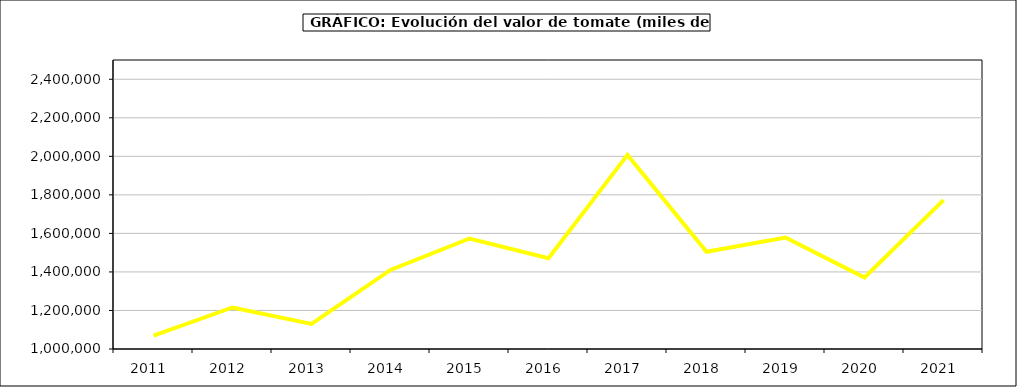
| Category | Valor |
|---|---|
| 2011.0 | 1069974.828 |
| 2012.0 | 1215542.465 |
| 2013.0 | 1130344.662 |
| 2014.0 | 1410496.854 |
| 2015.0 | 1573527 |
| 2016.0 | 1471672 |
| 2017.0 | 2007555.581 |
| 2018.0 | 1504491.723 |
| 2019.0 | 1578676.476 |
| 2020.0 | 1371069.32 |
| 2021.0 | 1772908.302 |